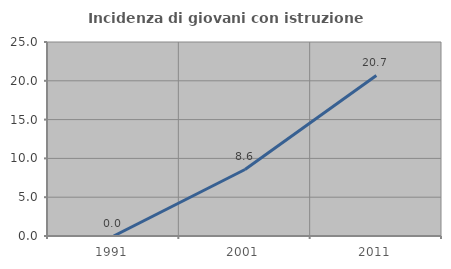
| Category | Incidenza di giovani con istruzione universitaria |
|---|---|
| 1991.0 | 0 |
| 2001.0 | 8.571 |
| 2011.0 | 20.69 |